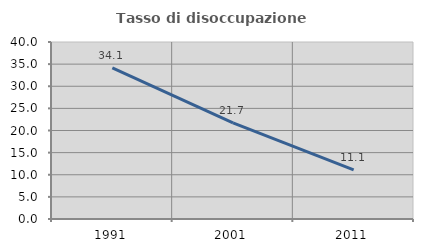
| Category | Tasso di disoccupazione giovanile  |
|---|---|
| 1991.0 | 34.146 |
| 2001.0 | 21.739 |
| 2011.0 | 11.111 |